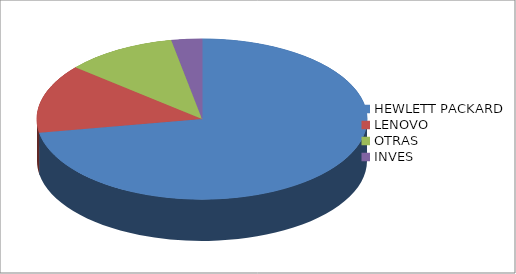
| Category | Series 0 |
|---|---|
| HEWLETT PACKARD | 73 |
| LENOVO | 14 |
| OTRAS | 11 |
| INVES | 3 |